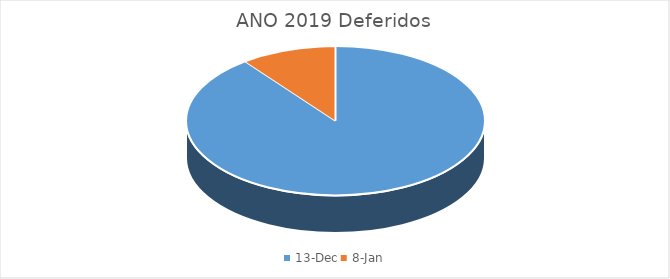
| Category | ANO 2019 |
|---|---|
| 43812.0 | 1 |
| 43473.0 | 0 |